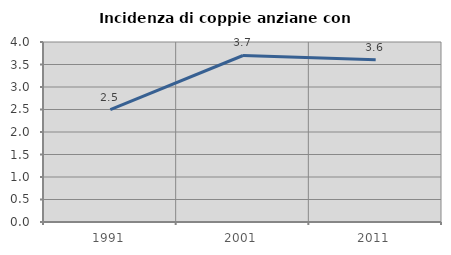
| Category | Incidenza di coppie anziane con figli |
|---|---|
| 1991.0 | 2.499 |
| 2001.0 | 3.7 |
| 2011.0 | 3.606 |